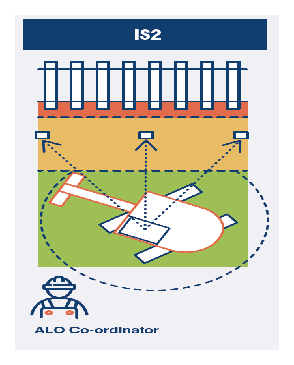
| Category | IS1 | IS2 | IS3 | Please Select New Planned Working Position |
|---|---|---|---|---|
| 0 |  | 1 |  |  |